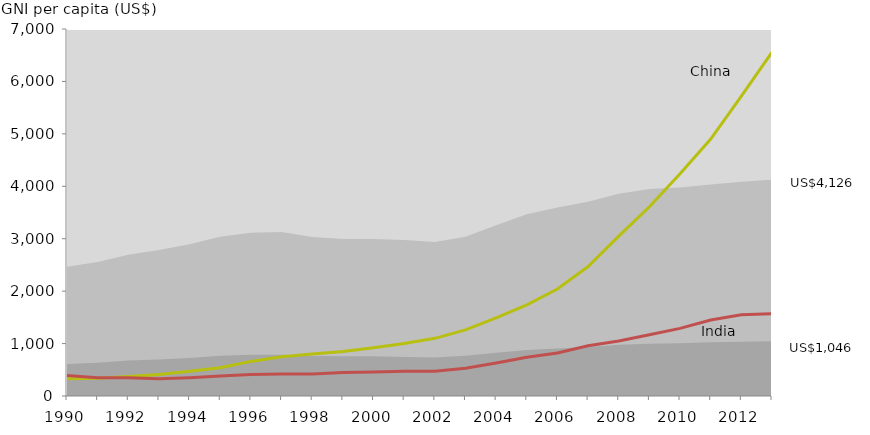
| Category | China | India |
|---|---|---|
|  | 330 | 390 |
|  | 340 | 350 |
|  | 370 | 350 |
|  | 410 | 330 |
|  | 470 | 350 |
|  | 540 | 380 |
|  | 660 | 410 |
|  | 750 | 420 |
|  | 800 | 420 |
|  | 850 | 450 |
|  | 920 | 460 |
|  | 1000 | 470 |
|  | 1100 | 470 |
|  | 1260 | 530 |
|  | 1490 | 630 |
|  | 1740 | 740 |
|  | 2040 | 820 |
|  | 2470 | 960 |
|  | 3050 | 1050 |
|  | 3610 | 1170 |
|  | 4240 | 1290 |